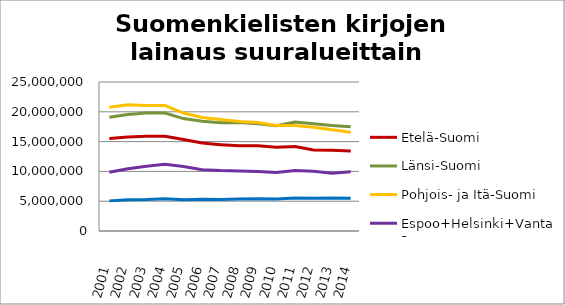
| Category | Etelä-Suomi | Länsi-Suomi | Pohjois- ja Itä-Suomi | Espoo+Helsinki+Vantaa | Muu Uusimaa |
|---|---|---|---|---|---|
| 2001.0 | 15529341 | 19075365 | 20758881 | 9873409 | 5054839 |
| 2002.0 | 15780355 | 19538778 | 21189039 | 10457269 | 5254770 |
| 2003.0 | 15901130 | 19780353 | 21057211 | 10877111 | 5272676 |
| 2004.0 | 15908434 | 19795664 | 21047207 | 11191032 | 5420186 |
| 2005.0 | 15338805 | 18862049 | 19788866 | 10819247 | 5243727 |
| 2006.0 | 14751870 | 18428635 | 19040994 | 10269323 | 5323637 |
| 2007.0 | 14485592 | 18171060 | 18708148 | 10132068 | 5288635 |
| 2008.0 | 14283655 | 18191596 | 18376405 | 10074363 | 5366845 |
| 2009.0 | 14304140 | 17987768 | 18221012 | 9971110 | 5418434 |
| 2010.0 | 14054453 | 17672414 | 17713631 | 9830203 | 5368165 |
| 2011.0 | 14173364 | 18274240 | 17682960 | 10144100 | 5533254 |
| 2012.0 | 13601694 | 17978304 | 17407259 | 10014961 | 5506066 |
| 2013.0 | 13561006 | 17685315 | 16980965 | 9694673 | 5540570 |
| 2014.0 | 13402492 | 17505483 | 16550472 | 9941241 | 5501111 |